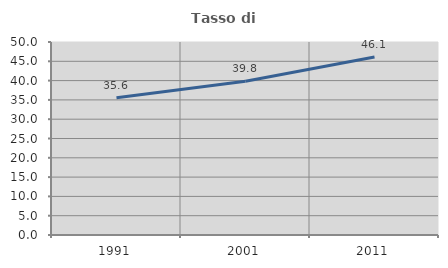
| Category | Tasso di occupazione   |
|---|---|
| 1991.0 | 35.578 |
| 2001.0 | 39.807 |
| 2011.0 | 46.105 |